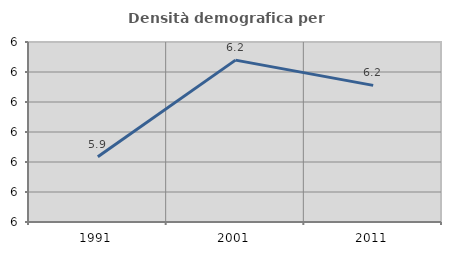
| Category | Densità demografica |
|---|---|
| 1991.0 | 5.917 |
| 2001.0 | 6.24 |
| 2011.0 | 6.155 |